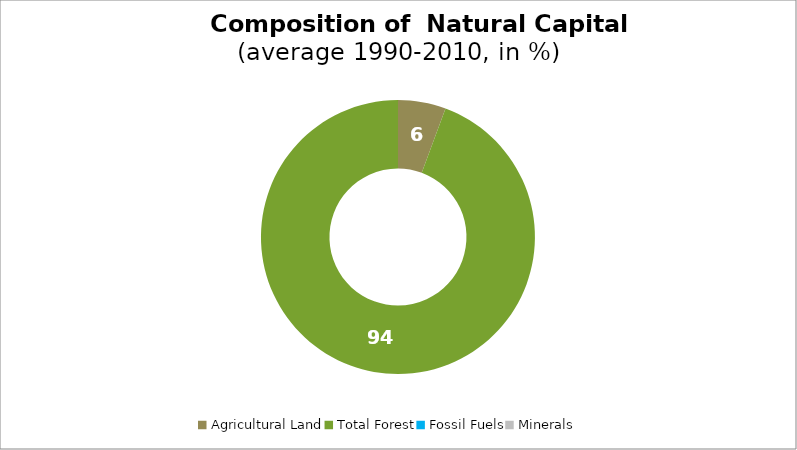
| Category | Series 0 |
|---|---|
| Agricultural Land | 5.636 |
| Total Forest | 94.364 |
| Fossil Fuels | 0 |
| Minerals | 0 |